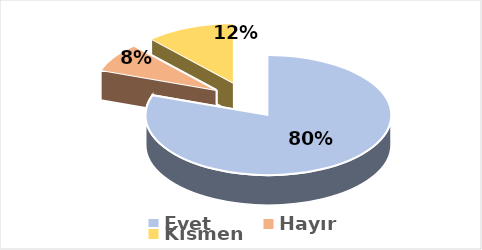
| Category | Evet |
|---|---|
| Evet | 0.804 |
| Hayır | 0.078 |
| Kısmen | 0.118 |